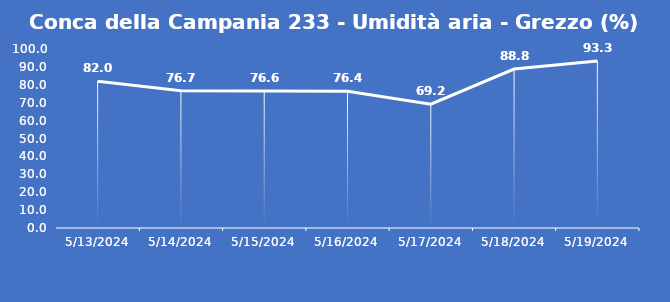
| Category | Conca della Campania 233 - Umidità aria - Grezzo (%) |
|---|---|
| 5/13/24 | 82 |
| 5/14/24 | 76.7 |
| 5/15/24 | 76.6 |
| 5/16/24 | 76.4 |
| 5/17/24 | 69.2 |
| 5/18/24 | 88.8 |
| 5/19/24 | 93.3 |